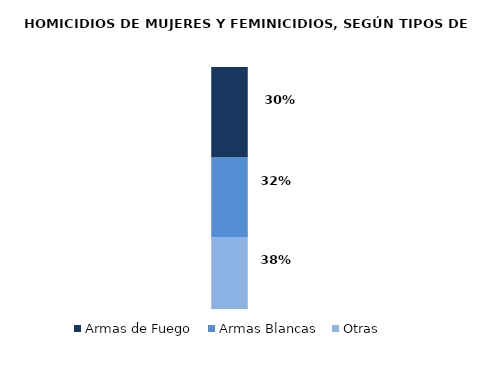
| Category | Otras | Armas Blancas | Armas de Fuego |
|---|---|---|---|
| 0 | 62 | 69 | 78 |